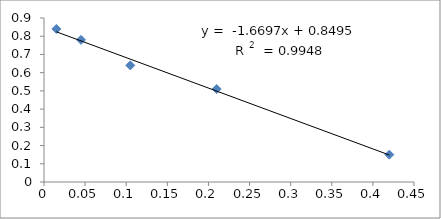
| Category | Series 0 |
|---|---|
| 0.015 | 0.84 |
| 0.045 | 0.78 |
| 0.105 | 0.64 |
| 0.21 | 0.51 |
| 0.42 | 0.15 |